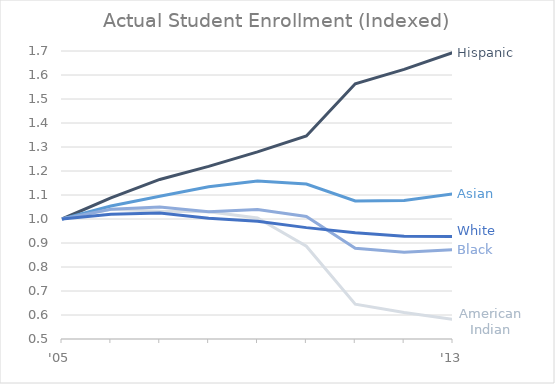
| Category | Series 0 | Series 1 | Series 2 | Series 3 | Series 4 |
|---|---|---|---|---|---|
| '05 | 1 | 1 | 1 | 1 | 1 |
|  | 1.088 | 1.041 | 1.054 | 1.041 | 1.019 |
|  | 1.165 | 1.032 | 1.095 | 1.05 | 1.025 |
|  | 1.219 | 1.03 | 1.134 | 1.03 | 1.003 |
|  | 1.28 | 1.004 | 1.159 | 1.04 | 0.99 |
|  | 1.346 | 0.887 | 1.146 | 1.011 | 0.964 |
|  | 1.564 | 0.645 | 1.075 | 0.878 | 0.943 |
|  | 1.624 | 0.61 | 1.077 | 0.862 | 0.928 |
| '13 | 1.694 | 0.582 | 1.105 | 0.872 | 0.927 |